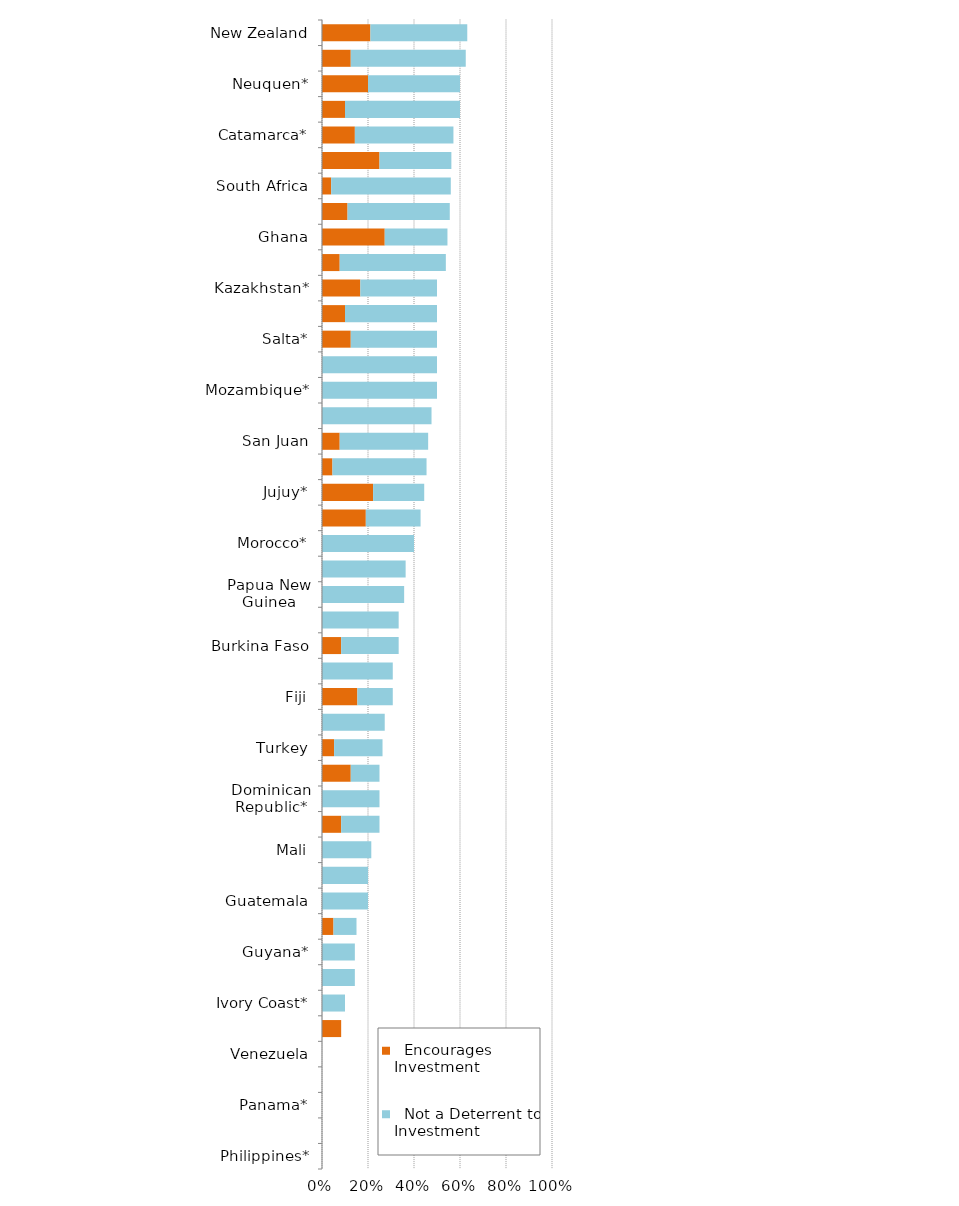
| Category |   Encourages Investment |   Not a Deterrent to Investment |
|---|---|---|
| Philippines* | 0 | 0 |
| Kenya* | 0 | 0 |
| Panama* | 0 | 0 |
| Suriname* | 0 | 0 |
| Venezuela | 0 | 0 |
| Democratic Republic of Congo (DRC) | 0.083 | 0 |
| Ivory Coast* | 0 | 0.1 |
| Ethiopia* | 0 | 0.143 |
| Guyana* | 0 | 0.143 |
| Ecuador | 0.05 | 0.1 |
| Guatemala | 0 | 0.2 |
| Romania* | 0 | 0.2 |
| Mali | 0 | 0.214 |
| Bolivia | 0.083 | 0.167 |
| Dominican Republic* | 0 | 0.25 |
| China* | 0.125 | 0.125 |
| Turkey | 0.053 | 0.211 |
| Indonesia | 0 | 0.273 |
| Fiji | 0.154 | 0.154 |
| Zambia | 0 | 0.308 |
| Burkina Faso | 0.083 | 0.25 |
| Serbia* | 0 | 0.333 |
| Papua New Guinea | 0 | 0.357 |
| Nicaragua* | 0 | 0.364 |
| Morocco* | 0 | 0.4 |
| Brazil | 0.19 | 0.238 |
| Jujuy* | 0.222 | 0.222 |
| Colombia | 0.045 | 0.409 |
| San Juan | 0.077 | 0.385 |
| Tanzania | 0 | 0.476 |
| Mozambique* | 0 | 0.5 |
| Zimbabwe | 0 | 0.5 |
| Salta* | 0.125 | 0.375 |
| French Guiana | 0.1 | 0.4 |
| Kazakhstan* | 0.167 | 0.333 |
| Santa Cruz | 0.077 | 0.462 |
| Ghana | 0.273 | 0.273 |
| Chubut* | 0.111 | 0.444 |
| South Africa | 0.04 | 0.52 |
| Washington | 0.25 | 0.312 |
| Catamarca* | 0.143 | 0.429 |
| Mendoza | 0.1 | 0.5 |
| Neuquen* | 0.2 | 0.4 |
| Russia* | 0.125 | 0.5 |
| New Zealand | 0.211 | 0.421 |